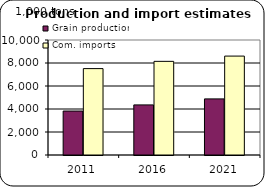
| Category | Grain production | Com. imports |
|---|---|---|
| 2011.0 | 3822.454 | 7513.557 |
| 2016.0 | 4357.243 | 8143.609 |
| 2021.0 | 4879.281 | 8601.434 |